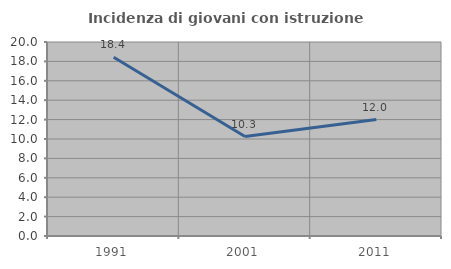
| Category | Incidenza di giovani con istruzione universitaria |
|---|---|
| 1991.0 | 18.421 |
| 2001.0 | 10.256 |
| 2011.0 | 12 |